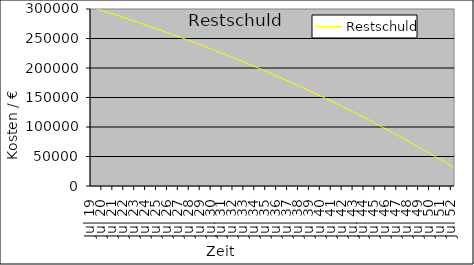
| Category | Restschuld |
|---|---|
| 2019-07-01 | 303585 |
| 2019-08-01 | 303104.324 |
| 2019-09-01 | 302622.846 |
| 2019-10-01 | 302140.567 |
| 2019-11-01 | 301657.483 |
| 2019-12-01 | 301173.594 |
| 2020-01-01 | 300688.899 |
| 2020-02-01 | 300203.396 |
| 2020-03-01 | 299717.084 |
| 2020-04-01 | 299229.961 |
| 2020-05-01 | 298742.026 |
| 2020-06-01 | 298253.278 |
| 2020-07-01 | 297763.716 |
| 2020-08-01 | 297273.337 |
| 2020-09-01 | 296782.142 |
| 2020-10-01 | 296290.127 |
| 2020-11-01 | 295797.293 |
| 2020-12-01 | 295303.637 |
| 2021-01-01 | 294809.159 |
| 2021-02-01 | 294313.856 |
| 2021-03-01 | 293817.728 |
| 2021-04-01 | 293320.773 |
| 2021-05-01 | 292822.99 |
| 2021-06-01 | 292324.377 |
| 2021-07-01 | 291824.933 |
| 2021-08-01 | 291324.656 |
| 2021-09-01 | 290823.546 |
| 2021-10-01 | 290321.601 |
| 2021-11-01 | 289818.819 |
| 2021-12-01 | 289315.199 |
| 2022-01-01 | 288810.74 |
| 2022-02-01 | 288305.44 |
| 2022-03-01 | 287799.298 |
| 2022-04-01 | 287292.312 |
| 2022-05-01 | 286784.481 |
| 2022-06-01 | 286275.804 |
| 2022-07-01 | 285766.279 |
| 2022-08-01 | 285255.905 |
| 2022-09-01 | 284744.68 |
| 2022-10-01 | 284232.603 |
| 2022-11-01 | 283719.673 |
| 2022-12-01 | 283205.888 |
| 2023-01-01 | 282691.247 |
| 2023-02-01 | 282175.747 |
| 2023-03-01 | 281659.389 |
| 2023-04-01 | 281142.17 |
| 2023-05-01 | 280624.089 |
| 2023-06-01 | 280105.145 |
| 2023-07-01 | 279585.335 |
| 2023-08-01 | 279064.66 |
| 2023-09-01 | 278543.116 |
| 2023-10-01 | 278020.703 |
| 2023-11-01 | 277497.42 |
| 2023-12-01 | 276973.265 |
| 2024-01-01 | 276448.235 |
| 2024-02-01 | 275922.331 |
| 2024-03-01 | 275395.55 |
| 2024-04-01 | 274867.892 |
| 2024-05-01 | 274339.354 |
| 2024-06-01 | 273809.935 |
| 2024-07-01 | 273279.633 |
| 2024-08-01 | 272748.448 |
| 2024-09-01 | 272216.378 |
| 2024-10-01 | 271683.42 |
| 2024-11-01 | 271149.575 |
| 2024-12-01 | 270614.84 |
| 2025-01-01 | 270079.213 |
| 2025-02-01 | 269542.694 |
| 2025-03-01 | 269005.28 |
| 2025-04-01 | 268466.971 |
| 2025-05-01 | 267927.765 |
| 2025-06-01 | 267387.66 |
| 2025-07-01 | 266846.655 |
| 2025-08-01 | 266304.748 |
| 2025-09-01 | 265761.938 |
| 2025-10-01 | 265218.223 |
| 2025-11-01 | 264673.602 |
| 2025-12-01 | 264128.074 |
| 2026-01-01 | 263581.636 |
| 2026-02-01 | 263034.288 |
| 2026-03-01 | 262486.027 |
| 2026-04-01 | 261936.852 |
| 2026-05-01 | 261386.762 |
| 2026-06-01 | 260835.756 |
| 2026-07-01 | 260283.831 |
| 2026-08-01 | 259730.986 |
| 2026-09-01 | 259177.22 |
| 2026-10-01 | 258622.53 |
| 2026-11-01 | 258066.917 |
| 2026-12-01 | 257510.377 |
| 2027-01-01 | 256952.91 |
| 2027-02-01 | 256394.513 |
| 2027-03-01 | 255835.186 |
| 2027-04-01 | 255274.927 |
| 2027-05-01 | 254713.734 |
| 2027-06-01 | 254151.606 |
| 2027-07-01 | 253588.54 |
| 2027-08-01 | 253024.537 |
| 2027-09-01 | 252459.593 |
| 2027-10-01 | 251893.708 |
| 2027-11-01 | 251326.879 |
| 2027-12-01 | 250759.106 |
| 2028-01-01 | 250190.387 |
| 2028-02-01 | 249620.72 |
| 2028-03-01 | 249050.103 |
| 2028-04-01 | 248478.535 |
| 2028-05-01 | 247906.015 |
| 2028-06-01 | 247332.54 |
| 2028-07-01 | 246758.11 |
| 2028-08-01 | 246182.722 |
| 2028-09-01 | 245606.375 |
| 2028-10-01 | 245029.068 |
| 2028-11-01 | 244450.799 |
| 2028-12-01 | 243871.565 |
| 2029-01-01 | 243291.367 |
| 2029-02-01 | 242710.201 |
| 2029-03-01 | 242128.067 |
| 2029-04-01 | 241544.962 |
| 2029-05-01 | 240960.886 |
| 2029-06-01 | 240375.836 |
| 2029-07-01 | 239789.811 |
| 2029-08-01 | 239202.81 |
| 2029-09-01 | 238614.83 |
| 2029-10-01 | 238025.87 |
| 2029-11-01 | 237435.929 |
| 2029-12-01 | 236845.004 |
| 2030-01-01 | 236253.094 |
| 2030-02-01 | 235660.198 |
| 2030-03-01 | 235066.314 |
| 2030-04-01 | 234471.44 |
| 2030-05-01 | 233875.574 |
| 2030-06-01 | 233278.716 |
| 2030-07-01 | 232680.862 |
| 2030-08-01 | 232082.013 |
| 2030-09-01 | 231482.165 |
| 2030-10-01 | 230881.317 |
| 2030-11-01 | 230279.468 |
| 2030-12-01 | 229676.616 |
| 2031-01-01 | 229072.759 |
| 2031-02-01 | 228467.896 |
| 2031-03-01 | 227862.024 |
| 2031-04-01 | 227255.143 |
| 2031-05-01 | 226647.25 |
| 2031-06-01 | 226038.344 |
| 2031-07-01 | 225428.424 |
| 2031-08-01 | 224817.487 |
| 2031-09-01 | 224205.531 |
| 2031-10-01 | 223592.556 |
| 2031-11-01 | 222978.559 |
| 2031-12-01 | 222363.538 |
| 2032-01-01 | 221747.493 |
| 2032-02-01 | 221130.421 |
| 2032-03-01 | 220512.32 |
| 2032-04-01 | 219893.19 |
| 2032-05-01 | 219273.027 |
| 2032-06-01 | 218651.831 |
| 2032-07-01 | 218029.599 |
| 2032-08-01 | 217406.331 |
| 2032-09-01 | 216782.023 |
| 2032-10-01 | 216156.676 |
| 2032-11-01 | 215530.285 |
| 2032-12-01 | 214902.851 |
| 2033-01-01 | 214274.372 |
| 2033-02-01 | 213644.844 |
| 2033-03-01 | 213014.268 |
| 2033-04-01 | 212382.64 |
| 2033-05-01 | 211749.96 |
| 2033-06-01 | 211116.225 |
| 2033-07-01 | 210481.435 |
| 2033-08-01 | 209845.586 |
| 2033-09-01 | 209208.677 |
| 2033-10-01 | 208570.707 |
| 2033-11-01 | 207931.674 |
| 2033-12-01 | 207291.575 |
| 2034-01-01 | 206650.41 |
| 2034-02-01 | 206008.176 |
| 2034-03-01 | 205364.872 |
| 2034-04-01 | 204720.495 |
| 2034-05-01 | 204075.045 |
| 2034-06-01 | 203428.519 |
| 2034-07-01 | 202780.915 |
| 2034-08-01 | 202132.232 |
| 2034-09-01 | 201482.468 |
| 2034-10-01 | 200831.62 |
| 2034-11-01 | 200179.689 |
| 2034-12-01 | 199526.67 |
| 2035-01-01 | 198872.563 |
| 2035-02-01 | 198217.366 |
| 2035-03-01 | 197561.077 |
| 2035-04-01 | 196903.695 |
| 2035-05-01 | 196245.216 |
| 2035-06-01 | 195585.64 |
| 2035-07-01 | 194924.965 |
| 2035-08-01 | 194263.189 |
| 2035-09-01 | 193600.309 |
| 2035-10-01 | 192936.325 |
| 2035-11-01 | 192271.235 |
| 2035-12-01 | 191605.036 |
| 2036-01-01 | 190937.726 |
| 2036-02-01 | 190269.304 |
| 2036-03-01 | 189599.769 |
| 2036-04-01 | 188929.117 |
| 2036-05-01 | 188257.348 |
| 2036-06-01 | 187584.459 |
| 2036-07-01 | 186910.448 |
| 2036-08-01 | 186235.314 |
| 2036-09-01 | 185559.055 |
| 2036-10-01 | 184881.669 |
| 2036-11-01 | 184203.154 |
| 2036-12-01 | 183523.508 |
| 2037-01-01 | 182842.729 |
| 2037-02-01 | 182160.816 |
| 2037-03-01 | 181477.766 |
| 2037-04-01 | 180793.578 |
| 2037-05-01 | 180108.249 |
| 2037-06-01 | 179421.778 |
| 2037-07-01 | 178734.163 |
| 2037-08-01 | 178045.402 |
| 2037-09-01 | 177355.493 |
| 2037-10-01 | 176664.434 |
| 2037-11-01 | 175972.224 |
| 2037-12-01 | 175278.86 |
| 2038-01-01 | 174584.34 |
| 2038-02-01 | 173888.663 |
| 2038-03-01 | 173191.826 |
| 2038-04-01 | 172493.828 |
| 2038-05-01 | 171794.666 |
| 2038-06-01 | 171094.339 |
| 2038-07-01 | 170392.845 |
| 2038-08-01 | 169690.182 |
| 2038-09-01 | 168986.348 |
| 2038-10-01 | 168281.34 |
| 2038-11-01 | 167575.158 |
| 2038-12-01 | 166867.799 |
| 2039-01-01 | 166159.261 |
| 2039-02-01 | 165449.541 |
| 2039-03-01 | 164738.639 |
| 2039-04-01 | 164026.552 |
| 2039-05-01 | 163313.279 |
| 2039-06-01 | 162598.816 |
| 2039-07-01 | 161883.163 |
| 2039-08-01 | 161166.317 |
| 2039-09-01 | 160448.276 |
| 2039-10-01 | 159729.039 |
| 2039-11-01 | 159008.603 |
| 2039-12-01 | 158286.966 |
| 2040-01-01 | 157564.126 |
| 2040-02-01 | 156840.082 |
| 2040-03-01 | 156114.831 |
| 2040-04-01 | 155388.371 |
| 2040-05-01 | 154660.7 |
| 2040-06-01 | 153931.817 |
| 2040-07-01 | 153201.719 |
| 2040-08-01 | 152470.404 |
| 2040-09-01 | 151737.87 |
| 2040-10-01 | 151004.115 |
| 2040-11-01 | 150269.137 |
| 2040-12-01 | 149532.934 |
| 2041-01-01 | 148795.505 |
| 2041-02-01 | 148056.846 |
| 2041-03-01 | 147316.956 |
| 2041-04-01 | 146575.833 |
| 2041-05-01 | 145833.475 |
| 2041-06-01 | 145089.88 |
| 2041-07-01 | 144345.045 |
| 2041-08-01 | 143598.969 |
| 2041-09-01 | 142851.649 |
| 2041-10-01 | 142103.084 |
| 2041-11-01 | 141353.271 |
| 2041-12-01 | 140602.209 |
| 2042-01-01 | 139849.894 |
| 2042-02-01 | 139096.326 |
| 2042-03-01 | 138341.502 |
| 2042-04-01 | 137585.42 |
| 2042-05-01 | 136828.078 |
| 2042-06-01 | 136069.473 |
| 2042-07-01 | 135309.605 |
| 2042-08-01 | 134548.469 |
| 2042-09-01 | 133786.066 |
| 2042-10-01 | 133022.391 |
| 2042-11-01 | 132257.444 |
| 2042-12-01 | 131491.222 |
| 2043-01-01 | 130723.722 |
| 2043-02-01 | 129954.944 |
| 2043-03-01 | 129184.884 |
| 2043-04-01 | 128413.541 |
| 2043-05-01 | 127640.913 |
| 2043-06-01 | 126866.996 |
| 2043-07-01 | 126091.79 |
| 2043-08-01 | 125315.292 |
| 2043-09-01 | 124537.499 |
| 2043-10-01 | 123758.411 |
| 2043-11-01 | 122978.023 |
| 2043-12-01 | 122196.335 |
| 2044-01-01 | 121413.345 |
| 2044-02-01 | 120629.049 |
| 2044-03-01 | 119843.446 |
| 2044-04-01 | 119056.534 |
| 2044-05-01 | 118268.31 |
| 2044-06-01 | 117478.773 |
| 2044-07-01 | 116687.92 |
| 2044-08-01 | 115895.748 |
| 2044-09-01 | 115102.257 |
| 2044-10-01 | 114307.442 |
| 2044-11-01 | 113511.304 |
| 2044-12-01 | 112713.838 |
| 2045-01-01 | 111915.043 |
| 2045-02-01 | 111114.917 |
| 2045-03-01 | 110313.457 |
| 2045-04-01 | 109510.662 |
| 2045-05-01 | 108706.528 |
| 2045-06-01 | 107901.054 |
| 2045-07-01 | 107094.238 |
| 2045-08-01 | 106286.077 |
| 2045-09-01 | 105476.57 |
| 2045-10-01 | 104665.713 |
| 2045-11-01 | 103853.504 |
| 2045-12-01 | 103039.942 |
| 2046-01-01 | 102225.024 |
| 2046-02-01 | 101408.748 |
| 2046-03-01 | 100591.111 |
| 2046-04-01 | 99772.112 |
| 2046-05-01 | 98951.747 |
| 2046-06-01 | 98130.016 |
| 2046-07-01 | 97306.915 |
| 2046-08-01 | 96482.442 |
| 2046-09-01 | 95656.594 |
| 2046-10-01 | 94829.371 |
| 2046-11-01 | 94000.768 |
| 2046-12-01 | 93170.785 |
| 2047-01-01 | 92339.419 |
| 2047-02-01 | 91506.666 |
| 2047-03-01 | 90672.526 |
| 2047-04-01 | 89836.996 |
| 2047-05-01 | 89000.073 |
| 2047-06-01 | 88161.755 |
| 2047-07-01 | 87322.04 |
| 2047-08-01 | 86480.926 |
| 2047-09-01 | 85638.409 |
| 2047-10-01 | 84794.489 |
| 2047-11-01 | 83949.162 |
| 2047-12-01 | 83102.426 |
| 2048-01-01 | 82254.278 |
| 2048-02-01 | 81404.718 |
| 2048-03-01 | 80553.741 |
| 2048-04-01 | 79701.346 |
| 2048-05-01 | 78847.53 |
| 2048-06-01 | 77992.291 |
| 2048-07-01 | 77135.627 |
| 2048-08-01 | 76277.535 |
| 2048-09-01 | 75418.013 |
| 2048-10-01 | 74557.059 |
| 2048-11-01 | 73694.669 |
| 2048-12-01 | 72830.843 |
| 2049-01-01 | 71965.576 |
| 2049-02-01 | 71098.867 |
| 2049-03-01 | 70230.714 |
| 2049-04-01 | 69361.114 |
| 2049-05-01 | 68490.065 |
| 2049-06-01 | 67617.564 |
| 2049-07-01 | 66743.608 |
| 2049-08-01 | 65868.197 |
| 2049-09-01 | 64991.326 |
| 2049-10-01 | 64112.993 |
| 2049-11-01 | 63233.197 |
| 2049-12-01 | 62351.934 |
| 2050-01-01 | 61469.203 |
| 2050-02-01 | 60585 |
| 2050-03-01 | 59699.324 |
| 2050-04-01 | 58812.172 |
| 2050-05-01 | 57923.541 |
| 2050-06-01 | 57033.429 |
| 2050-07-01 | 56141.833 |
| 2050-08-01 | 55248.752 |
| 2050-09-01 | 54354.182 |
| 2050-10-01 | 53458.121 |
| 2050-11-01 | 52560.566 |
| 2050-12-01 | 51661.516 |
| 2051-01-01 | 50760.967 |
| 2051-02-01 | 49858.918 |
| 2051-03-01 | 48955.365 |
| 2051-04-01 | 48050.306 |
| 2051-05-01 | 47143.738 |
| 2051-06-01 | 46235.66 |
| 2051-07-01 | 45326.068 |
| 2051-08-01 | 44414.96 |
| 2051-09-01 | 43502.334 |
| 2051-10-01 | 42588.187 |
| 2051-11-01 | 41672.516 |
| 2051-12-01 | 40755.319 |
| 2052-01-01 | 39836.593 |
| 2052-02-01 | 38916.336 |
| 2052-03-01 | 37994.545 |
| 2052-04-01 | 37071.218 |
| 2052-05-01 | 36146.352 |
| 2052-06-01 | 35219.945 |
| 2052-07-01 | 34291.994 |
| 2052-08-01 | 33362.496 |
| 2052-09-01 | 32431.449 |
| 2052-10-01 | 31498.85 |